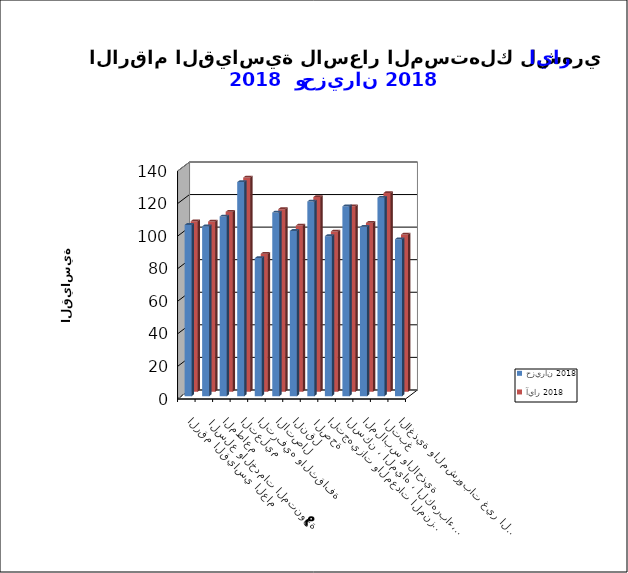
| Category | حزيران 2018      | آيار 2018       |
|---|---|---|
| الاغذية والمشروبات غير الكحولية | 96.4 | 96.5 |
|  التبغ | 121.9 | 122 |
| الملابس والاحذية | 104 | 103.7 |
| السكن ، المياه ، الكهرباء، الغاز  | 116.6 | 113.9 |
| التجهيزات والمعدات المنزلية والصيانة | 98.3 | 98.4 |
|  الصحة | 119.6 | 119.5 |
| النقل | 101.5 | 102 |
| الاتصال | 112.8 | 112.1 |
| الترفيه والثقافة | 84.8 | 84.7 |
| التعليم | 131.5 | 131.5 |
| المطاعم  | 110.4 | 110.5 |
|  السلع والخدمات المتنوعة | 104.3 | 104.5 |
| الرقم القياسي العام | 105.2 | 104.6 |